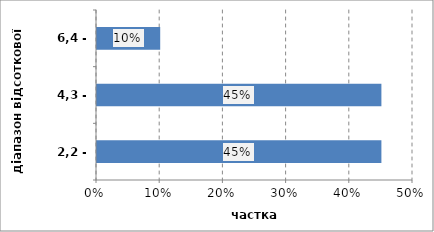
| Category | Series 0 |
|---|---|
| 2,2 - 4,3 | 0.45 |
| 4,3 - 6,4 | 0.45 |
| 6,4 - 8,5 | 0.1 |